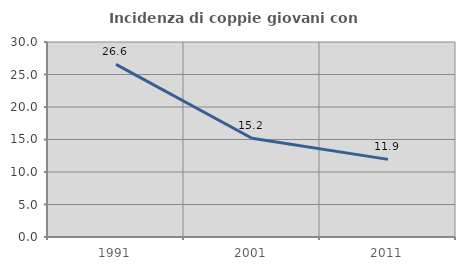
| Category | Incidenza di coppie giovani con figli |
|---|---|
| 1991.0 | 26.562 |
| 2001.0 | 15.188 |
| 2011.0 | 11.945 |